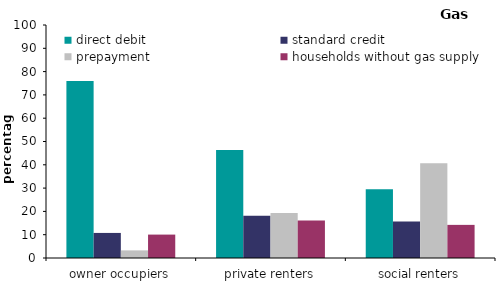
| Category | direct debit | standard credit | prepayment | households without gas supply |
|---|---|---|---|---|
| owner occupiers | 75.924 | 10.759 | 3.27 | 10.047 |
| private renters | 46.327 | 18.178 | 19.355 | 16.14 |
| social renters | 29.508 | 15.655 | 40.62 | 14.216 |